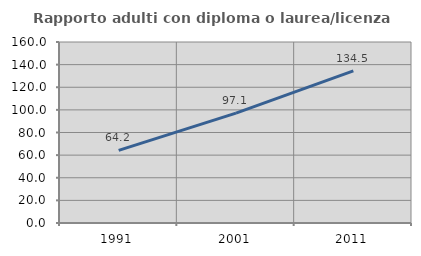
| Category | Rapporto adulti con diploma o laurea/licenza media  |
|---|---|
| 1991.0 | 64.177 |
| 2001.0 | 97.114 |
| 2011.0 | 134.473 |